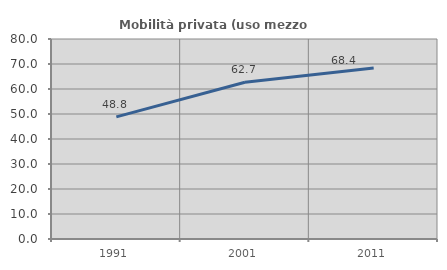
| Category | Mobilità privata (uso mezzo privato) |
|---|---|
| 1991.0 | 48.837 |
| 2001.0 | 62.68 |
| 2011.0 | 68.424 |